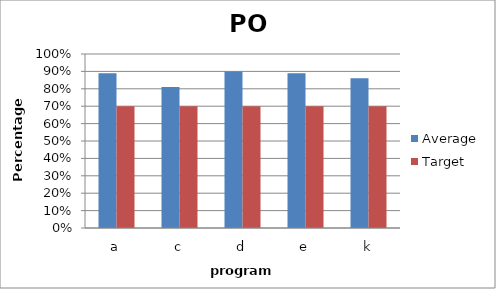
| Category | Average | Target |
|---|---|---|
| a | 0.89 | 0.7 |
| c | 0.81 | 0.7 |
| d | 0.9 | 0.7 |
| e | 0.89 | 0.7 |
| k | 0.86 | 0.7 |